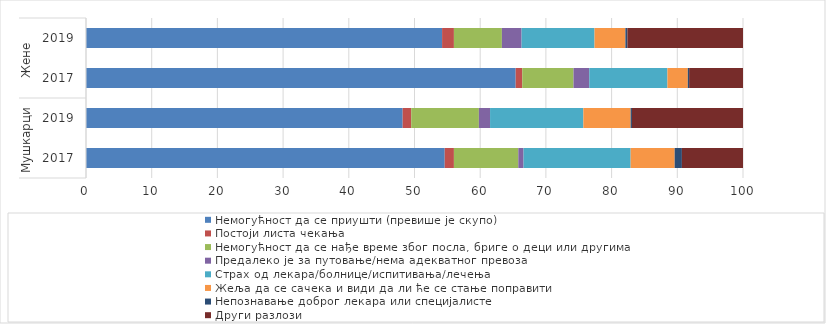
| Category | Немогућност да се приушти (превише је скупо) | Постоји листа чекања | Немогућност да се нађе време због посла, бриге о деци или другима | Предалеко је за путовање/нема адекватног превоза | Страх од лекара/болнице/испитивања/лечења | Жеља да се сачека и види да ли ће се стање поправити | Непознавање доброг лекара или специјалисте | Други разлози |
|---|---|---|---|---|---|---|---|---|
| 0 | 54.6 | 1.4 | 9.8 | 0.8 | 16.3 | 6.7 | 1.1 | 9.3 |
| 1 | 48.2 | 1.3 | 10.3 | 1.7 | 14.2 | 7.2 | 0.2 | 16.9 |
| 2 | 65.4 | 1 | 7.8 | 2.4 | 11.9 | 3.1 | 0.2 | 8.2 |
| 3 | 54.2 | 1.8 | 7.3 | 3 | 11.1 | 4.7 | 0.3 | 17.6 |